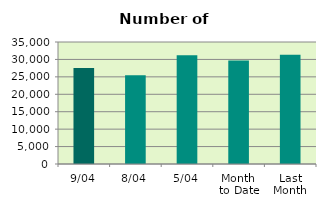
| Category | Series 0 |
|---|---|
| 9/04 | 27520 |
| 8/04 | 25426 |
| 5/04 | 31232 |
| Month 
to Date | 29692.286 |
| Last
Month | 31344.095 |